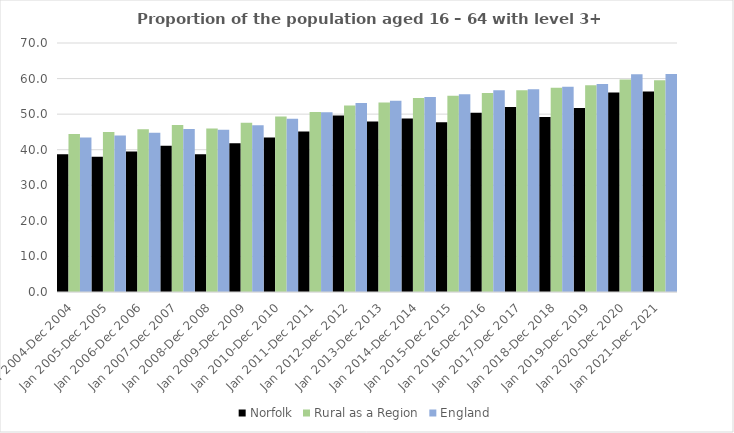
| Category | Norfolk | Rural as a Region | England |
|---|---|---|---|
| Jan 2004-Dec 2004 | 38.7 | 44.405 | 43.4 |
| Jan 2005-Dec 2005 | 38 | 44.973 | 44 |
| Jan 2006-Dec 2006 | 39.5 | 45.774 | 44.8 |
| Jan 2007-Dec 2007 | 41.1 | 46.968 | 45.8 |
| Jan 2008-Dec 2008 | 38.7 | 45.964 | 45.6 |
| Jan 2009-Dec 2009 | 41.8 | 47.59 | 46.9 |
| Jan 2010-Dec 2010 | 43.4 | 49.362 | 48.7 |
| Jan 2011-Dec 2011 | 45.1 | 50.602 | 50.5 |
| Jan 2012-Dec 2012 | 49.6 | 52.439 | 53.1 |
| Jan 2013-Dec 2013 | 47.9 | 53.276 | 53.8 |
| Jan 2014-Dec 2014 | 48.8 | 54.57 | 54.8 |
| Jan 2015-Dec 2015 | 47.7 | 55.16 | 55.6 |
| Jan 2016-Dec 2016 | 50.4 | 55.941 | 56.7 |
| Jan 2017-Dec 2017 | 52 | 56.689 | 57 |
| Jan 2018-Dec 2018 | 49.2 | 57.389 | 57.7 |
| Jan 2019-Dec 2019 | 51.7 | 58.147 | 58.5 |
| Jan 2020-Dec 2020 | 56.1 | 59.771 | 61.2 |
| Jan 2021-Dec 2021 | 56.4 | 59.54 | 61.3 |